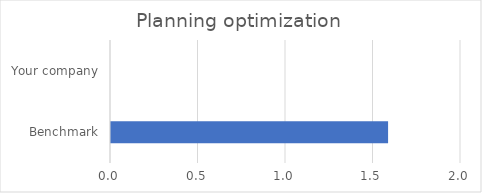
| Category | Planning optimization |
|---|---|
| Benchmark | 1.583 |
| Your company | 0 |